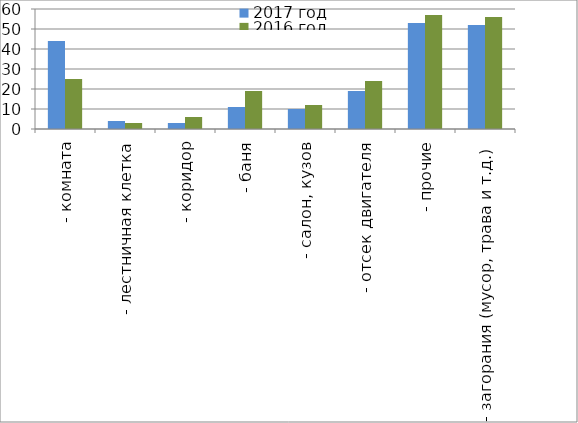
| Category | 2017 год | 2016 год |
|---|---|---|
|  - комната | 44 | 25 |
|  - лестничная клетка | 4 | 3 |
|  - коридор | 3 | 6 |
|  - баня | 11 | 19 |
|  - салон, кузов | 10 | 12 |
|  - отсек двигателя | 19 | 24 |
| - прочие | 53 | 57 |
| - загорания (мусор, трава и т.д.)  | 52 | 56 |